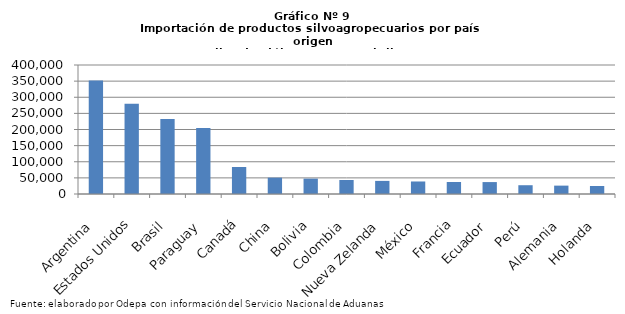
| Category | Series 0 |
|---|---|
| Argentina | 352307.78 |
| Estados Unidos | 279820.817 |
| Brasil | 232777.966 |
| Paraguay | 204868.579 |
| Canadá | 83643.742 |
| China | 50693.372 |
| Bolivia | 47650.3 |
| Colombia | 43448.885 |
| Nueva Zelanda | 40637.843 |
| México | 38808.871 |
| Francia | 37261.828 |
| Ecuador | 36969.587 |
| Perú | 27223.667 |
| Alemania | 25961.886 |
| Holanda | 24731.906 |